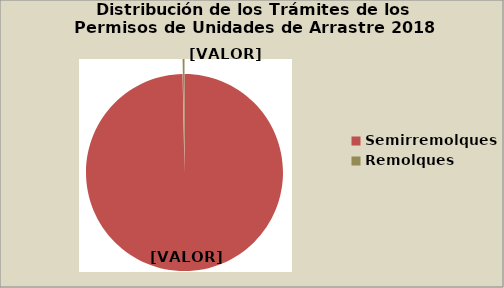
| Category | Series 0 |
|---|---|
| Semirremolques | 99.687 |
| Remolques | 0.313 |